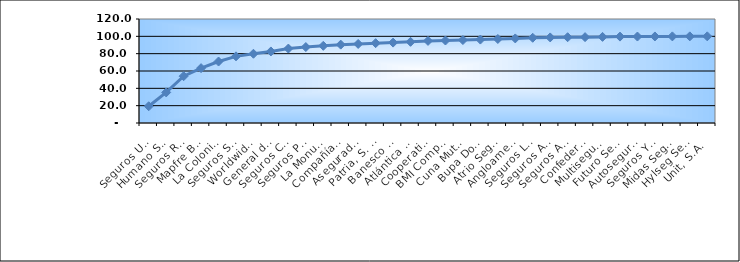
| Category | Series 0 |
|---|---|
| Seguros Universal, S. A. | 19.324 |
| Humano Seguros, S. A. | 35.277 |
| Seguros Reservas, S. A. | 54.003 |
| Mapfre BHD Compañía de Seguros | 63.29 |
| La Colonial, S. A., Compañia De Seguros | 70.926 |
| Seguros Sura, S.A. | 76.911 |
| Worldwide Seguros, S. A. | 79.894 |
| General de Seguros, S. A. | 82.571 |
| Seguros Crecer, S. A. | 85.872 |
| Seguros Pepín, S. A. | 87.634 |
| La Monumental de Seguros, S. A. | 89.055 |
| Compañía Dominicana de Seguros, C. por A. | 90.422 |
| Aseguradora Agropecuaria Dominicana, S. A. | 91.211 |
| Patria, S. A., Compañía de Seguros | 92.117 |
| Banesco Seguros | 92.776 |
| Atlántica Seguros, S. A. | 93.65 |
| Cooperativa Nacional De Seguros, Inc  | 94.724 |
| BMI Compañía de Seguros, S. A. | 95.175 |
| Cuna Mutual Insurance Society Dominicana | 95.703 |
| Bupa Dominicana, S. A. | 96.264 |
| Atrio Seguros S. A. | 96.934 |
| Angloamericana de Seguros, S. A. | 97.587 |
| Seguros La Internacional, S. A. | 98.342 |
| Seguros APS, S.R.L. | 98.733 |
| Seguros Ademi, S.A. | 98.981 |
| Confederación del Canadá Dominicana, S. A. | 99.08 |
| Multiseguros Su, S.A. | 99.364 |
| Futuro Seguros | 99.684 |
| Autoseguro, S. A. | 99.755 |
| Seguros Yunen, S.A. | 99.855 |
| Midas Seguros, S.A. | 99.937 |
| Hylseg Seguros S.A | 99.958 |
| Unit, S.A. | 100 |